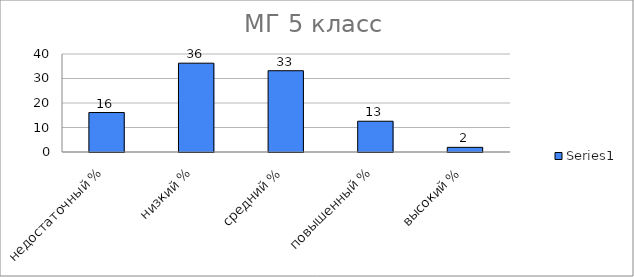
| Category | Series 0 |
|---|---|
| недостаточный % | 16.114 |
| низкий % | 36.256 |
| средний % | 33.175 |
| повышенный % | 12.559 |
| высокий % | 1.896 |